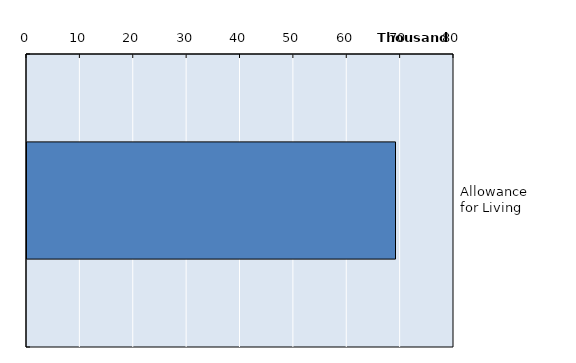
| Category | Series 0 |
|---|---|
| Allowance for Living | 69040 |